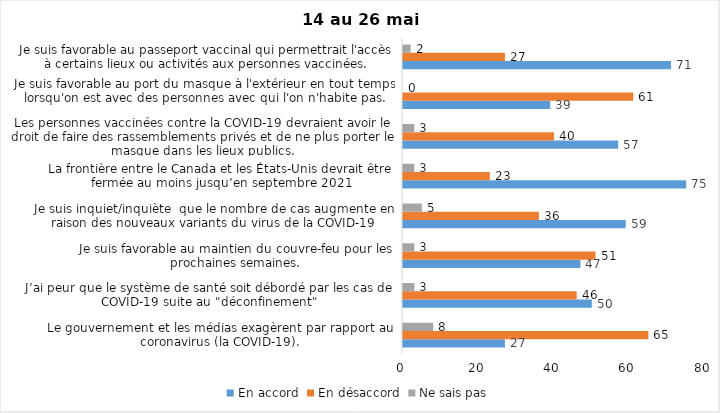
| Category | En accord | En désaccord | Ne sais pas |
|---|---|---|---|
| Le gouvernement et les médias exagèrent par rapport au coronavirus (la COVID-19). | 27 | 65 | 8 |
| J’ai peur que le système de santé soit débordé par les cas de COVID-19 suite au "déconfinement" | 50 | 46 | 3 |
| Je suis favorable au maintien du couvre-feu pour les prochaines semaines. | 47 | 51 | 3 |
| Je suis inquiet/inquiète  que le nombre de cas augmente en raison des nouveaux variants du virus de la COVID-19 | 59 | 36 | 5 |
| La frontière entre le Canada et les États-Unis devrait être fermée au moins jusqu’en septembre 2021 | 75 | 23 | 3 |
| Les personnes vaccinées contre la COVID-19 devraient avoir le droit de faire des rassemblements privés et de ne plus porter le masque dans les lieux publics. | 57 | 40 | 3 |
| Je suis favorable au port du masque à l'extérieur en tout temps lorsqu'on est avec des personnes avec qui l'on n'habite pas. | 39 | 61 | 0 |
| Je suis favorable au passeport vaccinal qui permettrait l'accès à certains lieux ou activités aux personnes vaccinées. | 71 | 27 | 2 |